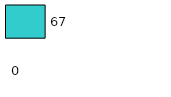
| Category | Series 0 | Series 1 |
|---|---|---|
| 0 | 0 | 67 |